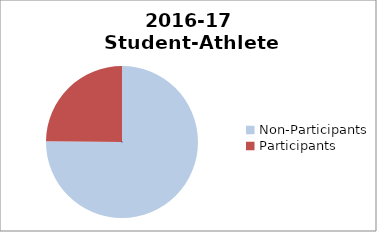
| Category | 2015-16 Student-Athlete Participation (Male) |
|---|---|
| Non-Participants | 857 |
| Participants | 283 |